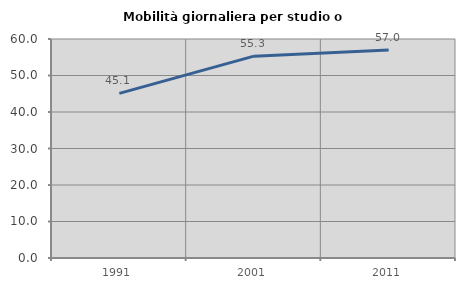
| Category | Mobilità giornaliera per studio o lavoro |
|---|---|
| 1991.0 | 45.091 |
| 2001.0 | 55.295 |
| 2011.0 | 56.956 |